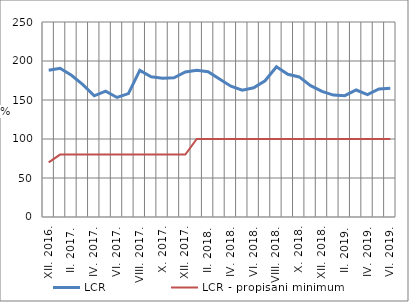
| Category | LCR | LCR - propisani minimum |
|---|---|---|
| XII. 2016. | 188.022 | 70 |
| I. 2017. | 190.625 | 80 |
| II. 2017. | 181.648 | 80 |
| III. 2017. | 169.614 | 80 |
| IV. 2017. | 155.35 | 80 |
| V. 2017. | 161.366 | 80 |
| VI. 2017. | 153.248 | 80 |
| VII. 2017. | 158.157 | 80 |
| VIII. 2017. | 187.93 | 80 |
| IX. 2017. | 179.808 | 80 |
| X. 2017. | 177.926 | 80 |
| XI. 2017. | 178.368 | 80 |
| XII. 2017. | 185.87 | 80 |
| I. 2018. | 188.112 | 100 |
| II. 2018. | 186.255 | 100 |
| III. 2018. | 176.901 | 100 |
| IV. 2018. | 167.696 | 100 |
| V. 2018. | 162.556 | 100 |
| VI. 2018. | 165.604 | 100 |
| VII. 2018. | 174.63 | 100 |
| VIII. 2018. | 192.564 | 100 |
| IX. 2018. | 182.94 | 100 |
| X. 2018. | 179.584 | 100 |
| XI. 2018. | 168.442 | 100 |
| XII. 2018. | 161.018 | 100 |
| I. 2019. | 156.26 | 100 |
| II. 2019. | 155.567 | 100 |
| III. 2019. | 162.82 | 100 |
| IV. 2019. | 156.989 | 100 |
| V. 2019. | 164.127 | 100 |
| VI. 2019. | 165.001 | 100 |